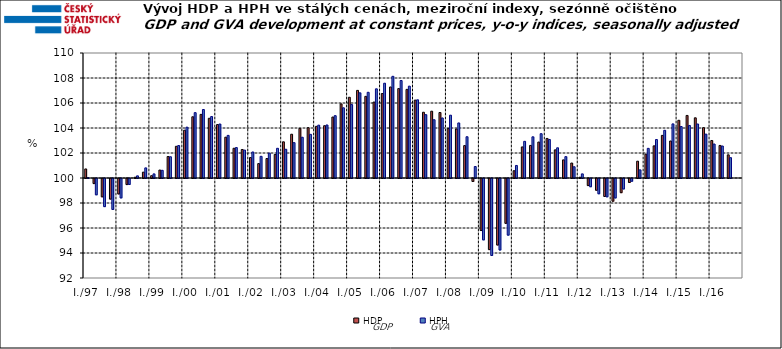
| Category | HDP

 | HPH

 |
|---|---|---|
| I./97 | 100.724 | 100.023 |
|  | 99.593 | 98.696 |
|  | 98.534 | 97.75 |
|  | 98.353 | 97.524 |
| I./98 | 98.764 | 98.448 |
|  | 99.514 | 99.521 |
|  | 100.062 | 100.171 |
|  | 100.468 | 100.809 |
| I./99 | 100.184 | 100.328 |
|  | 100.635 | 100.615 |
|  | 101.718 | 101.7 |
|  | 102.536 | 102.597 |
| I./00 | 103.823 | 104.066 |
|  | 104.898 | 105.228 |
|  | 105.09 | 105.478 |
|  | 104.778 | 104.915 |
| I./01 | 104.275 | 104.318 |
|  | 103.265 | 103.409 |
|  | 102.378 | 102.435 |
|  | 102.281 | 102.231 |
| I./02 | 101.633 | 102.082 |
|  | 101.154 | 101.735 |
|  | 101.558 | 101.989 |
|  | 101.886 | 102.375 |
| I./03 | 102.895 | 102.3 |
|  | 103.502 | 102.829 |
|  | 103.968 | 103.261 |
|  | 104.025 | 103.493 |
| I./04 | 104.133 | 104.228 |
|  | 104.183 | 104.242 |
|  | 104.877 | 104.987 |
|  | 105.93 | 105.616 |
| I./05 | 106.458 | 105.874 |
|  | 107.01 | 106.814 |
|  | 106.532 | 106.856 |
|  | 106.074 | 107.133 |
| I./06 | 106.757 | 107.582 |
|  | 107.281 | 108.134 |
|  | 107.154 | 107.801 |
|  | 107.09 | 107.348 |
| I./07 | 106.231 | 106.255 |
|  | 105.261 | 105.069 |
|  | 105.344 | 104.662 |
|  | 105.24 | 104.803 |
| I./08 | 103.952 | 105.025 |
|  | 103.919 | 104.404 |
|  | 102.591 | 103.301 |
|  | 99.763 | 100.917 |
| I./09 | 95.837 | 95.089 |
|  | 94.311 | 93.843 |
|  | 94.679 | 94.279 |
|  | 96.412 | 95.47 |
| I./10 | 100.58 | 101.003 |
|  | 102.485 | 102.933 |
|  | 102.607 | 103.294 |
|  | 102.876 | 103.545 |
| I./11 | 103.166 | 103.084 |
|  | 102.251 | 102.416 |
|  | 101.45 | 101.709 |
|  | 101.196 | 100.898 |
| I./12 | 100.062 | 100.329 |
|  | 99.434 | 99.341 |
|  | 99.06 | 98.779 |
|  | 98.564 | 98.536 |
| I./13 | 98.182 | 98.444 |
|  | 98.865 | 99.164 |
|  | 99.681 | 99.781 |
|  | 101.344 | 100.651 |
| I./14 | 101.912 | 102.372 |
|  | 102.57 | 103.077 |
|  | 103.409 | 103.816 |
|  | 102.96 | 104.328 |
| I./15 | 104.618 | 104.117 |
|  | 105.004 | 104.204 |
|  | 104.815 | 104.321 |
|  | 104.027 | 103.51 |
| I./16 | 103 | 102.718 |